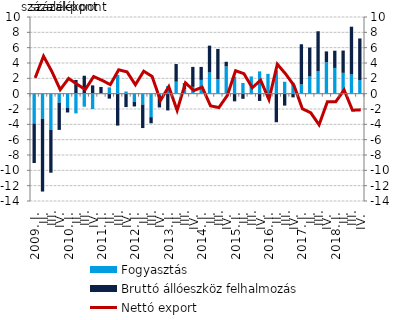
| Category | Fogyasztás | Bruttó állóeszköz felhalmozás |
|---|---|---|
| 2009. I. | -3.884 | -5.162 |
|          II. | -3.27 | -9.496 |
|          III. | -4.712 | -5.598 |
|          IV. | -1.173 | -3.553 |
| 2010. I. | -1.869 | -0.582 |
|          II. | -2.568 | 1.789 |
|          III. | -1.697 | 2.337 |
|          IV. | -2.007 | 1.081 |
| 2011. I. | 0.064 | 0.812 |
|          II. | 0.82 | -0.646 |
|          III. | 2.441 | -4.163 |
|          IV. | 0.284 | -1.75 |
| 2012. I. | -1.086 | -0.584 |
|          II. | -1.425 | -3.061 |
|          III. | -3.065 | -0.799 |
|          IV. | -0.219 | -1.578 |
| 2013. I. | 1.001 | -2.188 |
| II. | 1.563 | 2.302 |
|          III. | 0.572 | 0.788 |
| IV. | 0.889 | 2.603 |
| 2014. I. | 1.794 | 1.696 |
| II. | 2.772 | 3.495 |
|          III. | 1.885 | 3.949 |
| IV. | 3.552 | 0.605 |
| 2015. I. | 2.225 | -1.001 |
| II. | 1.39 | -0.669 |
|          III. | 2.244 | -0.069 |
| IV. | 2.908 | -0.948 |
| 2016. I. | 2.588 | -0.462 |
| II. | 3.019 | -3.727 |
|          III. | 1.551 | -1.557 |
| IV. | 1.434 | -0.482 |
| 2017. I. | 1.203 | 5.242 |
| II. | 2.251 | 3.764 |
|          III. | 2.947 | 5.195 |
| IV. | 4.097 | 1.416 |
| 2018. I. | 3.359 | 2.244 |
| II. | 2.718 | 2.908 |
|          III. | 2.507 | 6.227 |
| IV. | 1.77 | 5.431 |